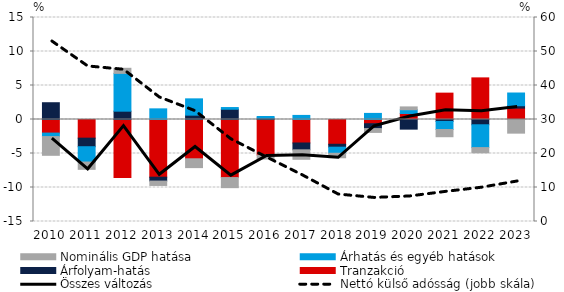
| Category | Tranzakció | Árfolyam-hatás | Árhatás és egyéb hatások | Nominális GDP hatása |
|---|---|---|---|---|
| 2010.0 | -1.998 | 2.468 | -0.513 | -2.755 |
| 2011.0 | -2.743 | -1.259 | -2.252 | -1.075 |
| 2012.0 | -8.512 | 1.223 | 5.559 | 0.749 |
| 2013.0 | -8.484 | -0.571 | 1.566 | -0.645 |
| 2014.0 | -5.778 | 0.638 | 2.399 | -1.3 |
| 2015.0 | -8.538 | 1.507 | 0.252 | -1.484 |
| 2016.0 | -5.233 | 0.205 | 0.236 | -0.582 |
| 2017.0 | -3.454 | -1.005 | 0.601 | -1.393 |
| 2018.0 | -3.642 | -0.43 | -0.891 | -0.664 |
| 2019.0 | -0.618 | -0.716 | 0.897 | -0.564 |
| 2020.0 | 0.879 | -1.418 | 0.556 | 0.417 |
| 2021.0 | 3.877 | -0.286 | -1.188 | -1.058 |
| 2022.0 | 6.12 | -0.775 | -3.359 | -0.765 |
| 2023.0 | 1.672 | 0.354 | 1.869 | -2.008 |